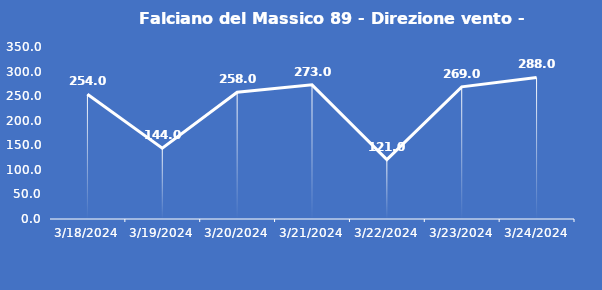
| Category | Falciano del Massico 89 - Direzione vento - Grezzo (°N) |
|---|---|
| 3/18/24 | 254 |
| 3/19/24 | 144 |
| 3/20/24 | 258 |
| 3/21/24 | 273 |
| 3/22/24 | 121 |
| 3/23/24 | 269 |
| 3/24/24 | 288 |